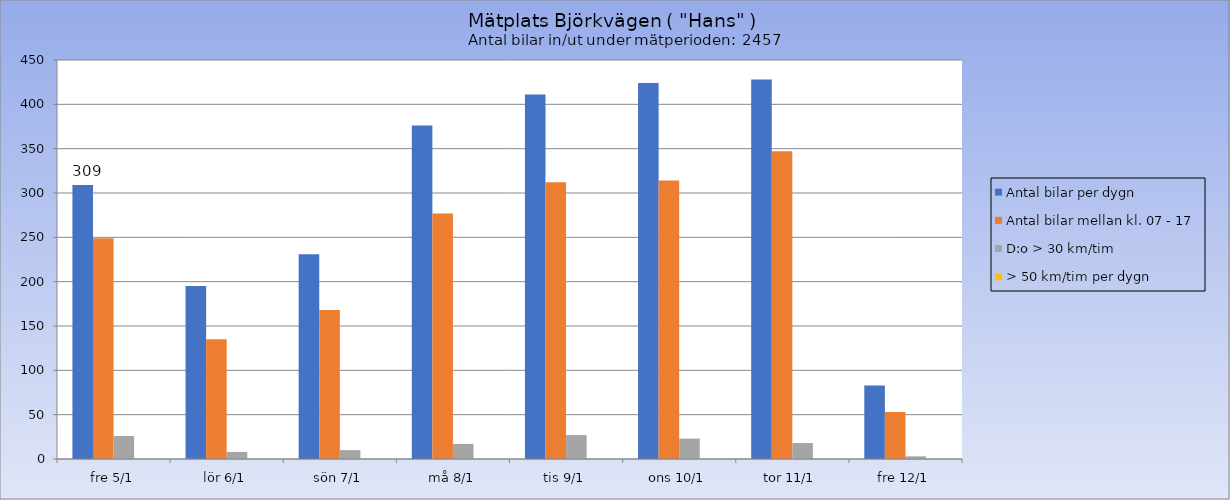
| Category | Antal bilar per dygn | Antal bilar mellan kl. 07 - 17 | D:o > 30 km/tim | > 50 km/tim per dygn |
|---|---|---|---|---|
| fre 5/1 | 309 | 249 | 26 | 0 |
| lör 6/1 | 195 | 135 | 8 | 0 |
| sön 7/1 | 231 | 168 | 10 | 0 |
| må 8/1 | 376 | 277 | 17 | 0 |
| tis 9/1 | 411 | 312 | 27 | 0 |
| ons 10/1 | 424 | 314 | 23 | 0 |
| tor 11/1 | 428 | 347 | 18 | 0 |
| fre 12/1 | 83 | 53 | 3 | 0 |